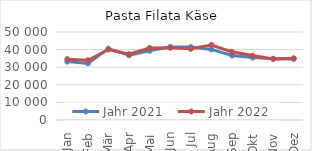
| Category | Jahr 2021 | Jahr 2022 |
|---|---|---|
| Jan | 33178.502 | 34576.92 |
| Feb | 32156.752 | 33932.541 |
| Mär | 40543.6 | 40064.9 |
| Apr | 36799.55 | 37375.669 |
| Mai | 39327.262 | 40951.625 |
| Jun | 41540.864 | 41015.75 |
| Jul | 41438.783 | 40438.794 |
| Aug | 40102.448 | 42631.834 |
| Sep | 36650.067 | 38737.334 |
| Okt | 35483.283 | 36593.363 |
| Nov | 34796.114 | 34694.623 |
| Dez | 34683.476 | 35085.663 |